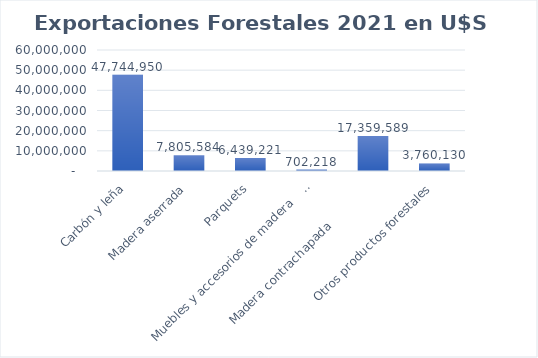
| Category | Series 0 |
|---|---|
| Carbón y leña | 47744950 |
| Madera aserrada | 7805584 |
| Parquets | 6439221 |
| Muebles y accesorios de madera                     | 702218 |
| Madera contrachapada               | 17359589 |
| Otros productos forestales | 3760130 |